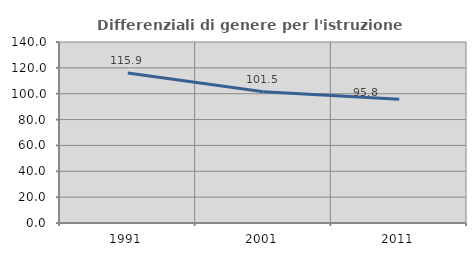
| Category | Differenziali di genere per l'istruzione superiore |
|---|---|
| 1991.0 | 115.947 |
| 2001.0 | 101.544 |
| 2011.0 | 95.792 |